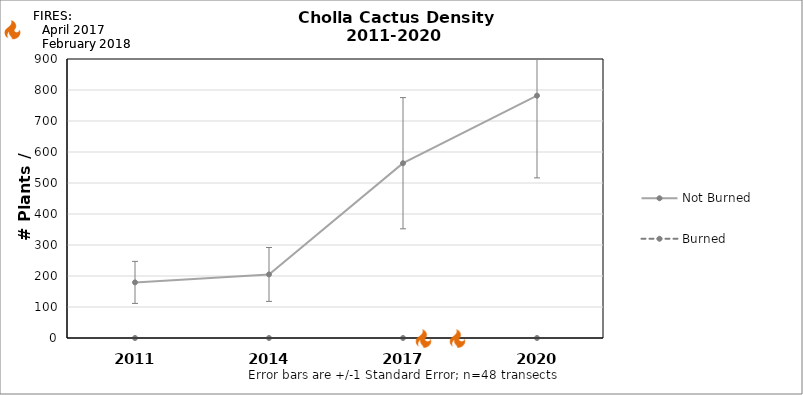
| Category | Not Burned | Burned |
|---|---|---|
| 2011.0 | 179.398 | 0 |
| 2014.0 | 205.027 | 0 |
| 2017.0 | 563.823 | 0 |
| 2020.0 | 781.664 | 0 |